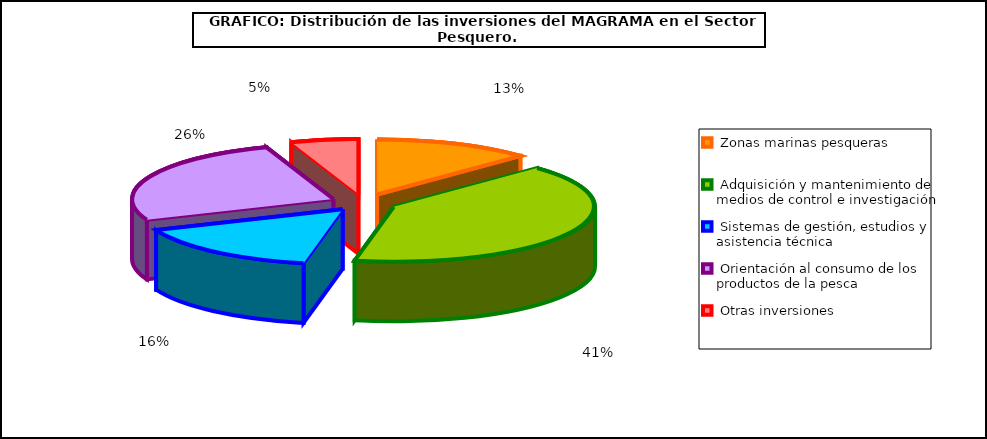
| Category | Series 0 |
|---|---|
|  Zonas marinas pesqueras | 3294.4 |
|  Adquisición y mantenimiento de medios de control e investigación  | 10583.72 |
|  Sistemas de gestión, estudios y asistencia técnica | 4112.87 |
|  Orientación al consumo de los productos de la pesca | 6726.23 |
|  Otras inversiones  | 1414.54 |